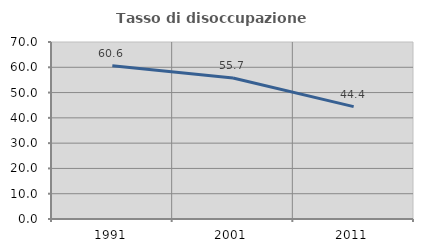
| Category | Tasso di disoccupazione giovanile  |
|---|---|
| 1991.0 | 60.615 |
| 2001.0 | 55.738 |
| 2011.0 | 44.444 |